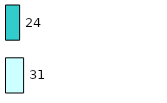
| Category | Series 0 | Series 1 |
|---|---|---|
| 0 | 31 | 24 |